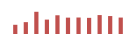
| Category | Importações (2) |
|---|---|
| 0 | 575.605 |
| 1 | 741.035 |
| 2 | 1388.881 |
| 3 | 899.436 |
| 4 | 1170.349 |
| 5 | 1022.737 |
| 6 | 1030.066 |
| 7 | 1010.02 |
| 8 | 1183.202 |
| 9 | 1121.55 |
| 10 | 1027.2 |